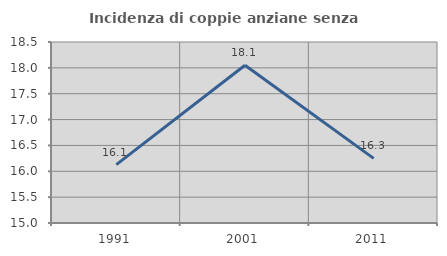
| Category | Incidenza di coppie anziane senza figli  |
|---|---|
| 1991.0 | 16.129 |
| 2001.0 | 18.051 |
| 2011.0 | 16.25 |